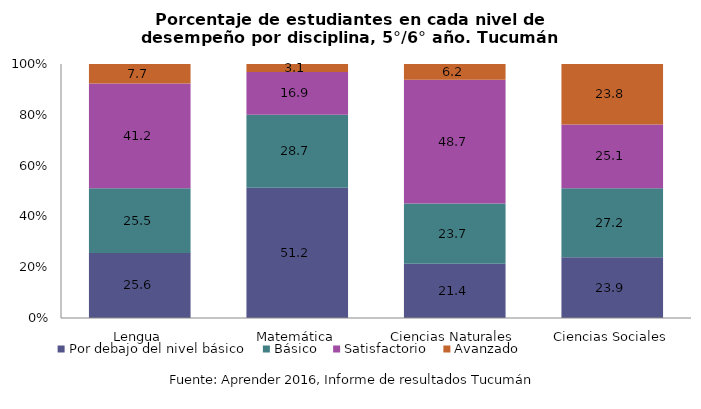
| Category | Por debajo del nivel básico | Básico | Satisfactorio | Avanzado |
|---|---|---|---|---|
| Lengua | 25.6 | 25.5 | 41.2 | 7.7 |
| Matemática | 51.2 | 28.7 | 16.9 | 3.1 |
| Ciencias Naturales | 21.4 | 23.7 | 48.7 | 6.2 |
| Ciencias Sociales | 23.9 | 27.2 | 25.1 | 23.8 |